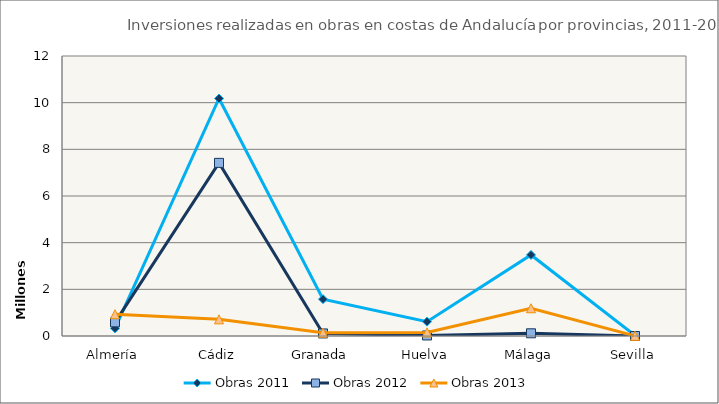
| Category | Obras 2011 | Obras 2012 | Obras 2013 |
|---|---|---|---|
| Almería | 328542.15 | 585544 | 933411.16 |
| Cádiz | 10179095.88 | 7419755 | 713559.91 |
| Granada | 1577926.69 | 109275 | 140991.16 |
| Huelva | 613607.39 | 22408 | 151877.36 |
| Málaga | 3473344.22 | 115846 | 1188380.88 |
| Sevilla | 22862.29 | 0 | 7145.33 |